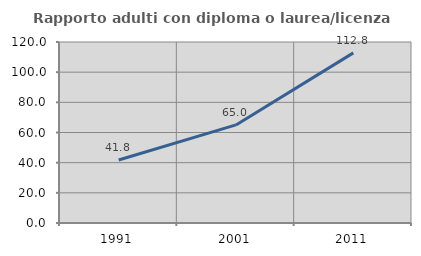
| Category | Rapporto adulti con diploma o laurea/licenza media  |
|---|---|
| 1991.0 | 41.765 |
| 2001.0 | 65.027 |
| 2011.0 | 112.805 |